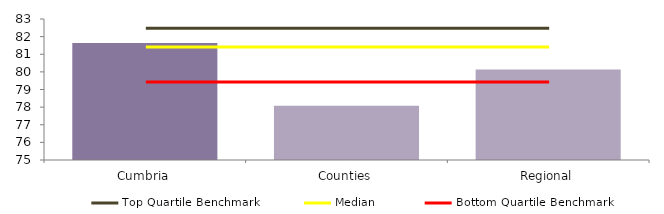
| Category | Block Data |
|---|---|
| Cumbria | 81.645 |
| Counties | 78.072 |
| Regional | 80.133 |